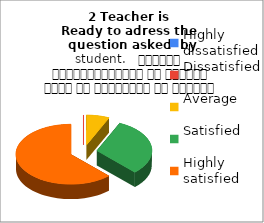
| Category | 2 Teacher is 
Ready to adress the  question asked  by student.   शिक्षक विद्यार्थियों के द्वारा पूछे गए प्रश्नों का समाधान करने हेतु तत्पर रहते हैं |
|---|---|
| Highly dissatisfied | 0 |
| Dissatisfied | 0 |
| Average | 5 |
| Satisfied | 23 |
| Highly satisfied | 46 |